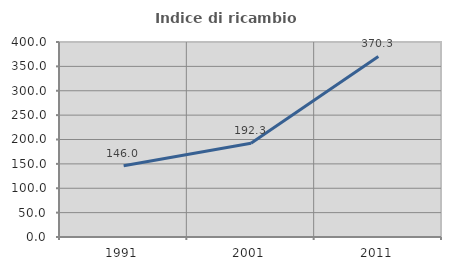
| Category | Indice di ricambio occupazionale  |
|---|---|
| 1991.0 | 146.02 |
| 2001.0 | 192.301 |
| 2011.0 | 370.279 |